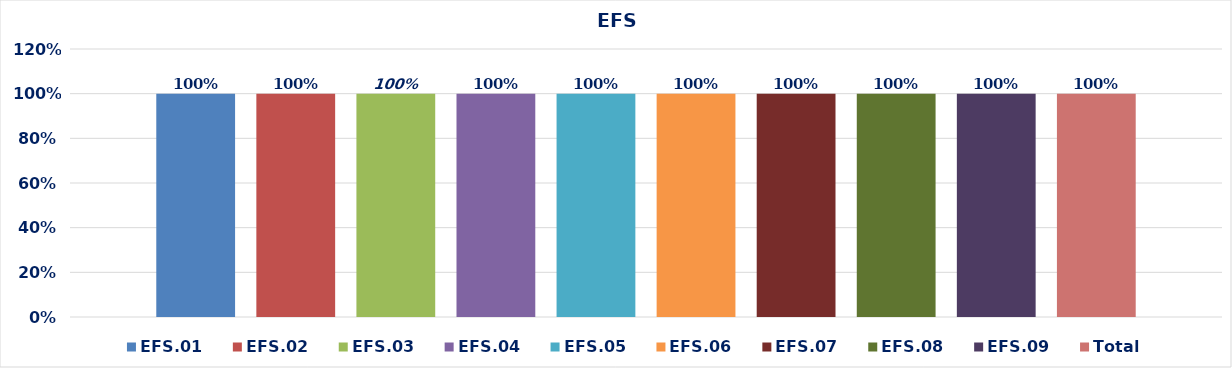
| Category | EFS.01 | EFS.02 | EFS.03 | EFS.04 | EFS.05 | EFS.06 | EFS.07 | EFS.08 | EFS.09 | Total |
|---|---|---|---|---|---|---|---|---|---|---|
| 0 | 1 | 1 | 1 | 1 | 1 | 1 | 1 | 1 | 1 | 1 |